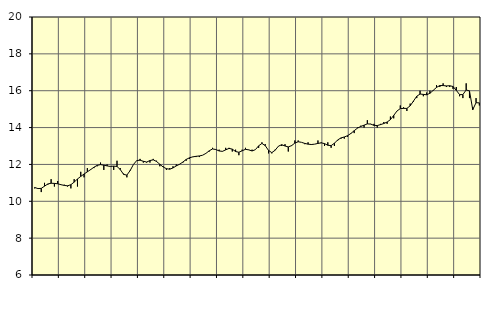
| Category | Piggar | Utbildning, SNI 85 |
|---|---|---|
| nan | 10.7 | 10.75 |
| 87.0 | 10.7 | 10.69 |
| 87.0 | 10.5 | 10.7 |
| 87.0 | 11 | 10.82 |
| nan | 10.9 | 10.94 |
| 88.0 | 11.2 | 10.98 |
| 88.0 | 10.8 | 10.97 |
| 88.0 | 11.1 | 10.95 |
| nan | 10.9 | 10.9 |
| 89.0 | 10.9 | 10.86 |
| 89.0 | 10.8 | 10.84 |
| 89.0 | 10.7 | 10.9 |
| nan | 11.2 | 11.04 |
| 90.0 | 10.8 | 11.21 |
| 90.0 | 11.6 | 11.35 |
| 90.0 | 11.3 | 11.48 |
| nan | 11.8 | 11.6 |
| 91.0 | 11.7 | 11.72 |
| 91.0 | 11.8 | 11.85 |
| 91.0 | 11.9 | 11.95 |
| nan | 12.1 | 11.99 |
| 92.0 | 11.7 | 11.96 |
| 92.0 | 12 | 11.92 |
| 92.0 | 11.9 | 11.89 |
| nan | 11.7 | 11.91 |
| 93.0 | 12.2 | 11.89 |
| 93.0 | 11.8 | 11.72 |
| 93.0 | 11.5 | 11.46 |
| nan | 11.3 | 11.42 |
| 94.0 | 11.7 | 11.67 |
| 94.0 | 12 | 12 |
| 94.0 | 12.2 | 12.21 |
| nan | 12.3 | 12.23 |
| 95.0 | 12.1 | 12.17 |
| 95.0 | 12.1 | 12.13 |
| 95.0 | 12.1 | 12.21 |
| nan | 12.3 | 12.25 |
| 96.0 | 12.2 | 12.16 |
| 96.0 | 11.9 | 12.01 |
| 96.0 | 11.9 | 11.86 |
| nan | 11.7 | 11.77 |
| 97.0 | 11.8 | 11.74 |
| 97.0 | 11.9 | 11.81 |
| 97.0 | 12 | 11.92 |
| nan | 12 | 12.01 |
| 98.0 | 12.1 | 12.13 |
| 98.0 | 12.2 | 12.27 |
| 98.0 | 12.3 | 12.36 |
| nan | 12.4 | 12.41 |
| 99.0 | 12.4 | 12.44 |
| 99.0 | 12.4 | 12.46 |
| 99.0 | 12.5 | 12.5 |
| nan | 12.6 | 12.6 |
| 0.0 | 12.7 | 12.74 |
| 0.0 | 12.9 | 12.84 |
| 0.0 | 12.8 | 12.81 |
| nan | 12.8 | 12.73 |
| 1.0 | 12.7 | 12.71 |
| 1.0 | 12.9 | 12.79 |
| 1.0 | 12.9 | 12.87 |
| nan | 12.7 | 12.83 |
| 2.0 | 12.8 | 12.7 |
| 2.0 | 12.5 | 12.66 |
| 2.0 | 12.8 | 12.74 |
| nan | 12.9 | 12.82 |
| 3.0 | 12.8 | 12.79 |
| 3.0 | 12.8 | 12.73 |
| 3.0 | 12.8 | 12.8 |
| nan | 12.9 | 13.01 |
| 4.0 | 13.2 | 13.14 |
| 4.0 | 13.1 | 13.02 |
| 4.0 | 12.6 | 12.76 |
| nan | 12.6 | 12.64 |
| 5.0 | 12.8 | 12.77 |
| 5.0 | 13 | 12.99 |
| 5.0 | 13 | 13.07 |
| nan | 13.1 | 13 |
| 6.0 | 12.7 | 12.95 |
| 6.0 | 13 | 13.02 |
| 6.0 | 13.3 | 13.16 |
| nan | 13.3 | 13.23 |
| 7.0 | 13.2 | 13.2 |
| 7.0 | 13.1 | 13.14 |
| 7.0 | 13.2 | 13.1 |
| nan | 13.1 | 13.08 |
| 8.0 | 13.1 | 13.1 |
| 8.0 | 13.3 | 13.14 |
| 8.0 | 13.2 | 13.17 |
| nan | 13 | 13.13 |
| 9.0 | 13.2 | 13.04 |
| 9.0 | 12.9 | 13.02 |
| 9.0 | 13 | 13.15 |
| nan | 13.3 | 13.33 |
| 10.0 | 13.4 | 13.44 |
| 10.0 | 13.4 | 13.49 |
| 10.0 | 13.5 | 13.56 |
| nan | 13.7 | 13.68 |
| 11.0 | 13.7 | 13.83 |
| 11.0 | 14 | 13.97 |
| 11.0 | 14.1 | 14.06 |
| nan | 14 | 14.13 |
| 12.0 | 14.4 | 14.2 |
| 12.0 | 14.2 | 14.19 |
| 12.0 | 14.2 | 14.12 |
| nan | 14 | 14.11 |
| 13.0 | 14.2 | 14.16 |
| 13.0 | 14.3 | 14.22 |
| 13.0 | 14.2 | 14.3 |
| nan | 14.6 | 14.43 |
| 14.0 | 14.5 | 14.66 |
| 14.0 | 14.9 | 14.9 |
| 14.0 | 15.2 | 15.03 |
| nan | 15.1 | 15.04 |
| 15.0 | 14.9 | 15.04 |
| 15.0 | 15.3 | 15.18 |
| 15.0 | 15.4 | 15.44 |
| nan | 15.6 | 15.7 |
| 16.0 | 16 | 15.82 |
| 16.0 | 15.7 | 15.8 |
| 16.0 | 15.9 | 15.78 |
| nan | 16 | 15.86 |
| 17.0 | 16 | 16.02 |
| 17.0 | 16.3 | 16.18 |
| 17.0 | 16.2 | 16.28 |
| nan | 16.4 | 16.28 |
| 18.0 | 16.2 | 16.26 |
| 18.0 | 16.2 | 16.27 |
| 18.0 | 16.1 | 16.23 |
| nan | 16.2 | 16.02 |
| 19.0 | 15.7 | 15.79 |
| 19.0 | 15.6 | 15.79 |
| 19.0 | 16.4 | 16.04 |
| nan | 15.6 | 15.99 |
| 20.0 | 15.1 | 14.97 |
| 20.0 | 15.6 | 15.35 |
| 20.0 | 15.2 | 15.34 |